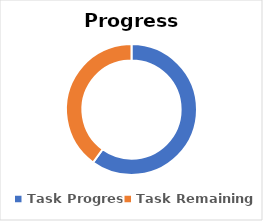
| Category | Series 0 |
|---|---|
| Task Progress | 0.6 |
| Task Remaining | 0.4 |